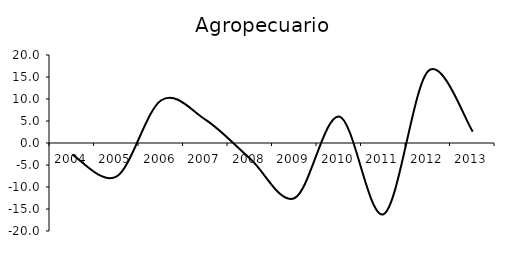
| Category | Agricultura, cría y explotación de animales, aprovechamiento forestal, pesca y caza |
|---|---|
| 2004.0 | -2.648 |
| 2005.0 | -7.59 |
| 2006.0 | 9.715 |
| 2007.0 | 5.254 |
| 2008.0 | -3.59 |
| 2009.0 | -12.494 |
| 2010.0 | 6.029 |
| 2011.0 | -16.153 |
| 2012.0 | 16.379 |
| 2013.0 | 2.6 |